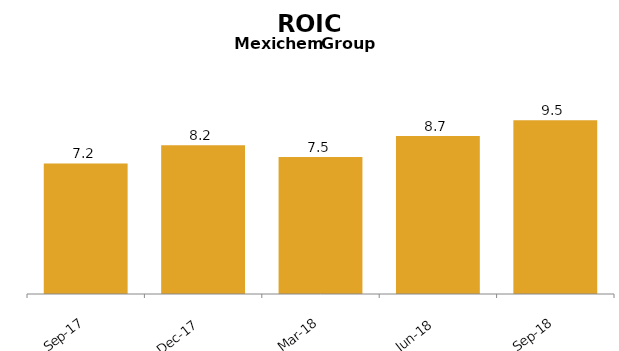
| Category | ROIC (%) |
|---|---|
| 2017-09-01 | 7.153 |
| 2017-12-01 | 8.156 |
| 2018-03-01 | 7.502 |
| 2018-06-01 | 8.657 |
| 2018-09-01 | 9.526 |